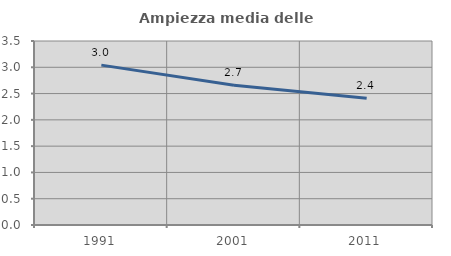
| Category | Ampiezza media delle famiglie |
|---|---|
| 1991.0 | 3.041 |
| 2001.0 | 2.659 |
| 2011.0 | 2.41 |